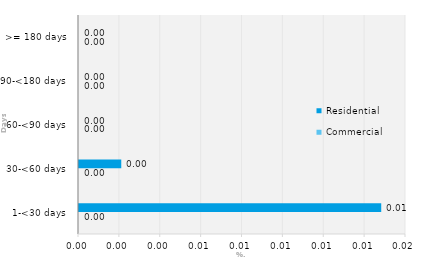
| Category | Commercial | Residential |
|---|---|---|
| 1-<30 days | 0 | 0.015 |
| 30-<60 days | 0 | 0.002 |
| 60-<90 days | 0 | 0 |
| 90-<180 days | 0 | 0 |
| >= 180 days | 0 | 0 |